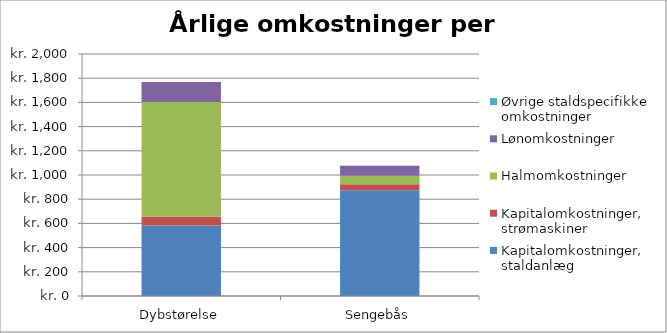
| Category | Kapitalomkostninger, staldanlæg | Kapitalomkostninger, strømaskiner  | Halmomkostninger  | Lønomkostninger | Øvrige staldspecifikke omkostninger |
|---|---|---|---|---|---|
| Dybstørelse | 582.993 | 72.257 | 949 | 164.25 | 0 |
| Sengebås | 874.49 | 48.171 | 71.175 | 82.125 | 0 |